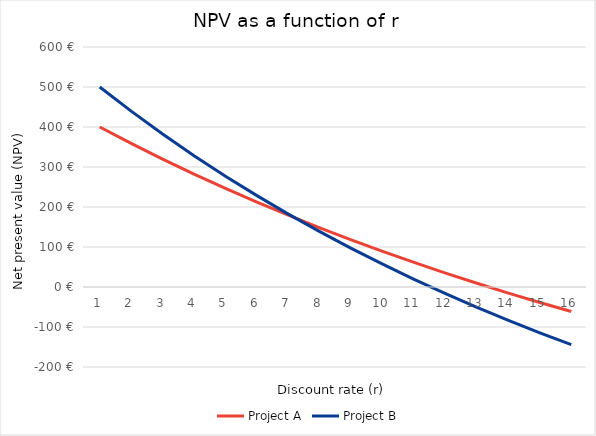
| Category | Project A | Project B |
|---|---|---|
| 0 | 400 | 500 |
| 1 | 358.961 | 439.673 |
| 2 | 319.769 | 382.547 |
| 3 | 282.318 | 328.421 |
| 4 | 246.51 | 277.104 |
| 5 | 212.253 | 228.423 |
| 6 | 179.462 | 182.214 |
| 7 | 148.055 | 138.328 |
| 8 | 117.959 | 96.624 |
| 9 | 89.102 | 56.971 |
| 10 | 61.42 | 19.249 |
| 11 | 34.851 | -16.657 |
| 12 | 9.337 | -50.851 |
| 13 | -15.175 | -83.432 |
| 14 | -38.737 | -114.492 |
| 15 | -61.397 | -144.116 |